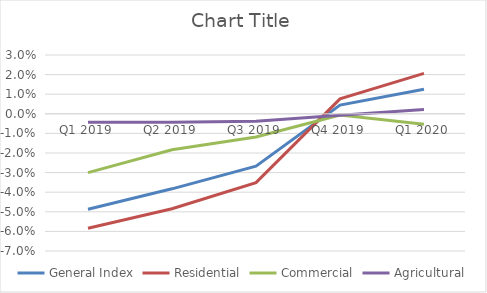
| Category | General Index | Residential | Commercial | Agricultural |
|---|---|---|---|---|
| Q1 2019 | -0.049 | -0.058 | -0.03 | -0.004 |
| Q2 2019 | -0.038 | -0.048 | -0.018 | -0.004 |
| Q3 2019 | -0.027 | -0.035 | -0.012 | -0.004 |
| Q4 2019 | 0.004 | 0.008 | -0.001 | -0.001 |
| Q1 2020 | 0.012 | 0.021 | -0.005 | 0.002 |